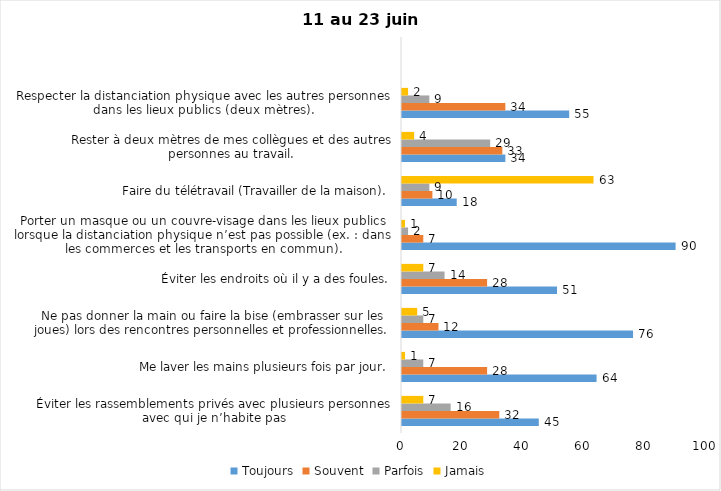
| Category | Toujours | Souvent | Parfois | Jamais |
|---|---|---|---|---|
| Éviter les rassemblements privés avec plusieurs personnes avec qui je n’habite pas | 45 | 32 | 16 | 7 |
| Me laver les mains plusieurs fois par jour. | 64 | 28 | 7 | 1 |
| Ne pas donner la main ou faire la bise (embrasser sur les joues) lors des rencontres personnelles et professionnelles. | 76 | 12 | 7 | 5 |
| Éviter les endroits où il y a des foules. | 51 | 28 | 14 | 7 |
| Porter un masque ou un couvre-visage dans les lieux publics lorsque la distanciation physique n’est pas possible (ex. : dans les commerces et les transports en commun). | 90 | 7 | 2 | 1 |
| Faire du télétravail (Travailler de la maison). | 18 | 10 | 9 | 63 |
| Rester à deux mètres de mes collègues et des autres personnes au travail. | 34 | 33 | 29 | 4 |
| Respecter la distanciation physique avec les autres personnes dans les lieux publics (deux mètres). | 55 | 34 | 9 | 2 |